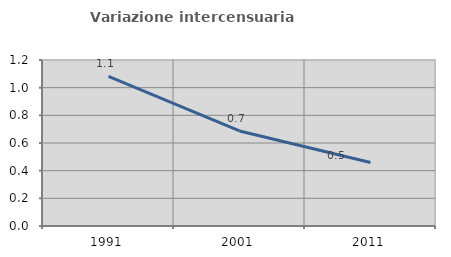
| Category | Variazione intercensuaria annua |
|---|---|
| 1991.0 | 1.082 |
| 2001.0 | 0.687 |
| 2011.0 | 0.459 |